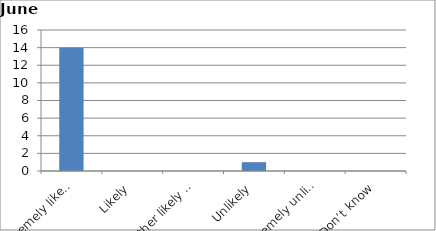
| Category | Series 0 |
|---|---|
| Extremely likely | 14 |
| Likely | 0 |
| Neither likely nor unlikely | 0 |
| Unlikely | 1 |
| Extremely unlikely | 0 |
| Don’t know | 0 |